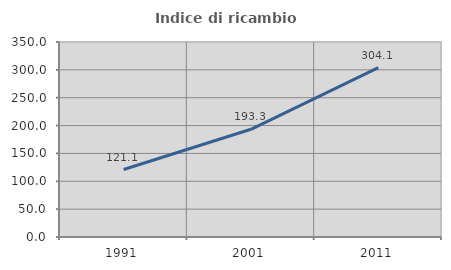
| Category | Indice di ricambio occupazionale  |
|---|---|
| 1991.0 | 121.11 |
| 2001.0 | 193.305 |
| 2011.0 | 304.148 |